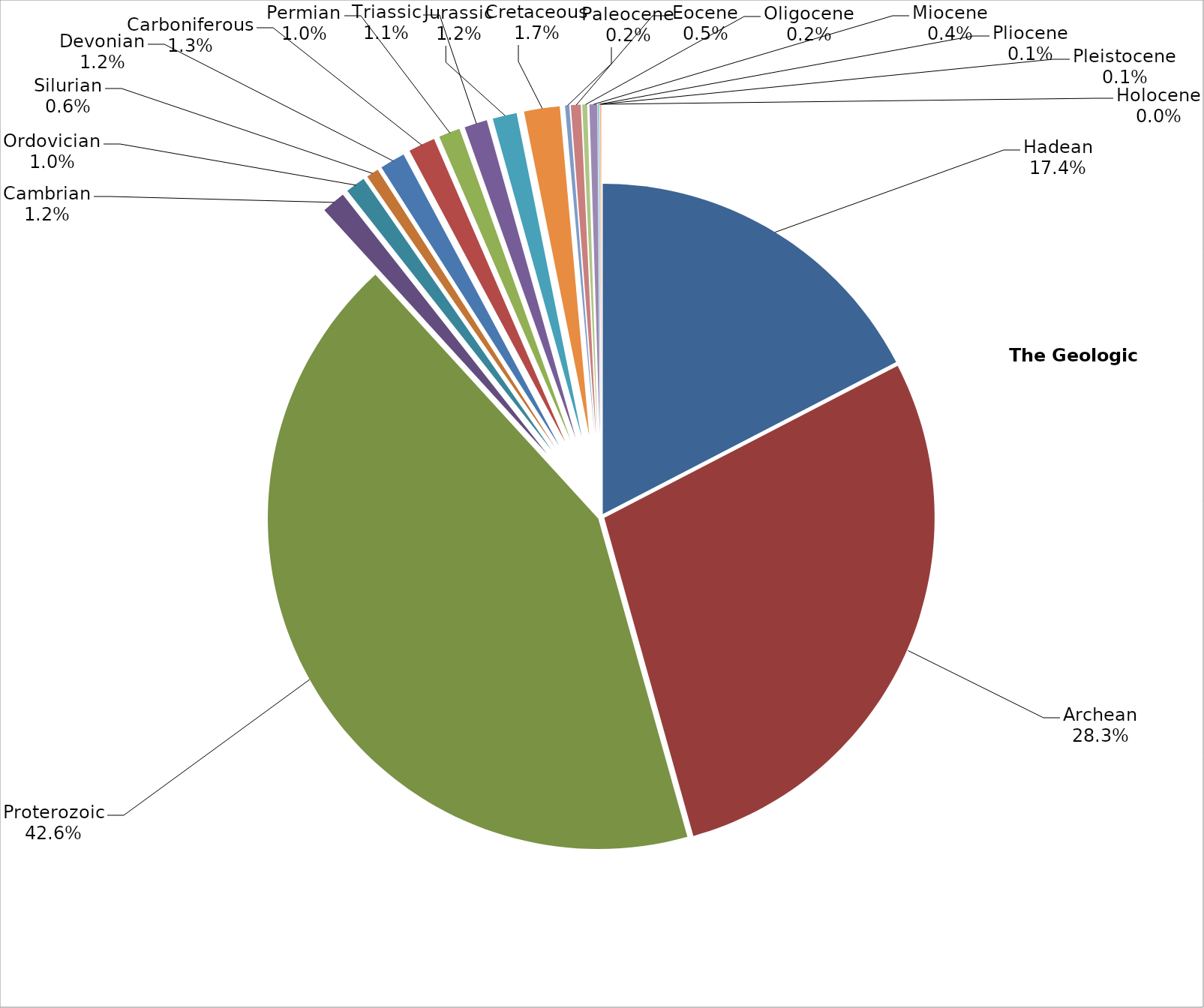
| Category | Series 0 |
|---|---|
| Hadean | 0.174 |
| Archean | 0.283 |
| Proterozoic | 0.426 |
| Cambrian | 0.012 |
| Ordovician | 0.01 |
| Silurian | 0.006 |
| Devonian | 0.012 |
| Carboniferous | 0.013 |
| Permian | 0.01 |
| Triassic | 0.011 |
| Jurassic | 0.012 |
| Cretaceous | 0.017 |
| Paleocene | 0.002 |
| Eocene | 0.005 |
| Oligocene | 0.002 |
| Miocene | 0.004 |
| Pliocene | 0.001 |
| Pleistocene | 0.001 |
| Holocene | 0 |